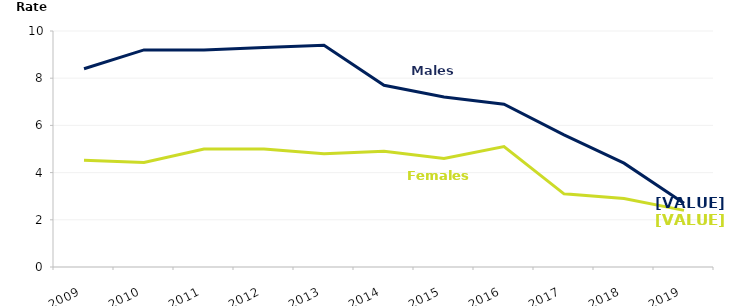
| Category | Male | Female |
|---|---|---|
| 2009.0 | 8.4 | 4.525 |
| 2010.0 | 9.2 | 4.429 |
| 2011.0 | 9.2 | 5 |
| 2012.0 | 9.3 | 5 |
| 2013.0 | 9.4 | 4.8 |
| 2014.0 | 7.7 | 4.9 |
| 2015.0 | 7.2 | 4.6 |
| 2016.0 | 6.9 | 5.1 |
| 2017.0 | 5.6 | 3.1 |
| 2018.0 | 4.4 | 2.9 |
| 2019.0 | 2.7 | 2.4 |